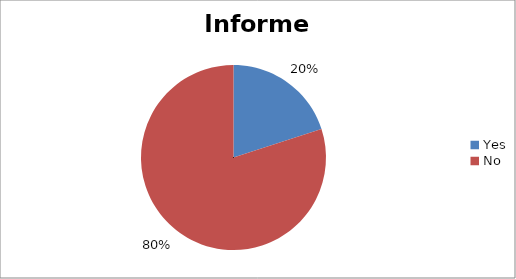
| Category | Informed |
|---|---|
| Yes | 3 |
| No | 12 |